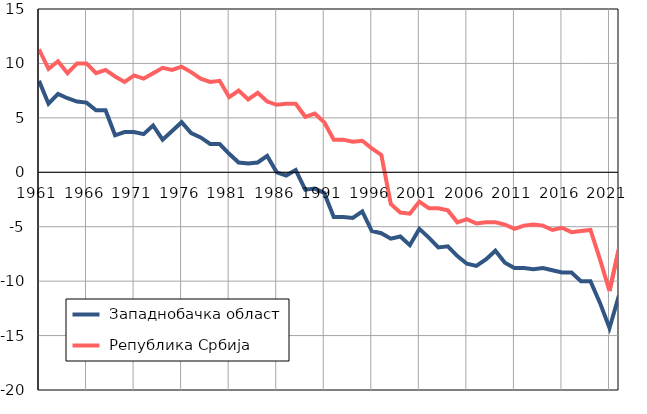
| Category |  Западнобачка област |  Република Србија |
|---|---|---|
| 1961.0 | 8.4 | 11.3 |
| 1962.0 | 6.3 | 9.5 |
| 1963.0 | 7.2 | 10.2 |
| 1964.0 | 6.8 | 9.1 |
| 1965.0 | 6.5 | 10 |
| 1966.0 | 6.4 | 10 |
| 1967.0 | 5.7 | 9.1 |
| 1968.0 | 5.7 | 9.4 |
| 1969.0 | 3.4 | 8.8 |
| 1970.0 | 3.7 | 8.3 |
| 1971.0 | 3.7 | 8.9 |
| 1972.0 | 3.5 | 8.6 |
| 1973.0 | 4.3 | 9.1 |
| 1974.0 | 3 | 9.6 |
| 1975.0 | 3.8 | 9.4 |
| 1976.0 | 4.6 | 9.7 |
| 1977.0 | 3.6 | 9.2 |
| 1978.0 | 3.2 | 8.6 |
| 1979.0 | 2.6 | 8.3 |
| 1980.0 | 2.6 | 8.4 |
| 1981.0 | 1.7 | 6.9 |
| 1982.0 | 0.9 | 7.5 |
| 1983.0 | 0.8 | 6.7 |
| 1984.0 | 0.9 | 7.3 |
| 1985.0 | 1.5 | 6.5 |
| 1986.0 | 0 | 6.2 |
| 1987.0 | -0.3 | 6.3 |
| 1988.0 | 0.2 | 6.3 |
| 1989.0 | -1.6 | 5.1 |
| 1990.0 | -1.5 | 5.4 |
| 1991.0 | -1.9 | 4.6 |
| 1992.0 | -4.1 | 3 |
| 1993.0 | -4.1 | 3 |
| 1994.0 | -4.2 | 2.8 |
| 1995.0 | -3.6 | 2.9 |
| 1996.0 | -5.4 | 2.2 |
| 1997.0 | -5.6 | 1.6 |
| 1998.0 | -6.1 | -2.9 |
| 1999.0 | -5.9 | -3.7 |
| 2000.0 | -6.7 | -3.8 |
| 2001.0 | -5.2 | -2.7 |
| 2002.0 | -6 | -3.3 |
| 2003.0 | -6.9 | -3.3 |
| 2004.0 | -6.8 | -3.5 |
| 2005.0 | -7.7 | -4.6 |
| 2006.0 | -8.4 | -4.3 |
| 2007.0 | -8.6 | -4.7 |
| 2008.0 | -8 | -4.6 |
| 2009.0 | -7.2 | -4.6 |
| 2010.0 | -8.3 | -4.8 |
| 2011.0 | -8.8 | -5.2 |
| 2012.0 | -8.8 | -4.9 |
| 2013.0 | -8.9 | -4.8 |
| 2014.0 | -8.8 | -4.9 |
| 2015.0 | -9 | -5.3 |
| 2016.0 | -9.2 | -5.1 |
| 2017.0 | -9.2 | -5.5 |
| 2018.0 | -10 | -5.4 |
| 2019.0 | -10 | -5.3 |
| 2020.0 | -12 | -8 |
| 2021.0 | -14.3 | -10.9 |
| 2022.0 | -11.3 | -7 |